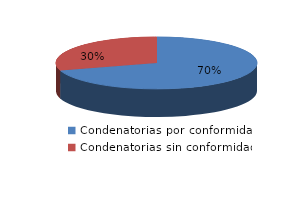
| Category | Series 0 |
|---|---|
| 0 | 408 |
| 1 | 173 |